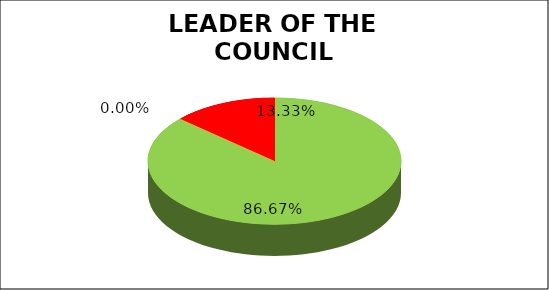
| Category | Q2 |
|---|---|
| Green | 0.867 |
| Amber | 0 |
| Red | 0.133 |